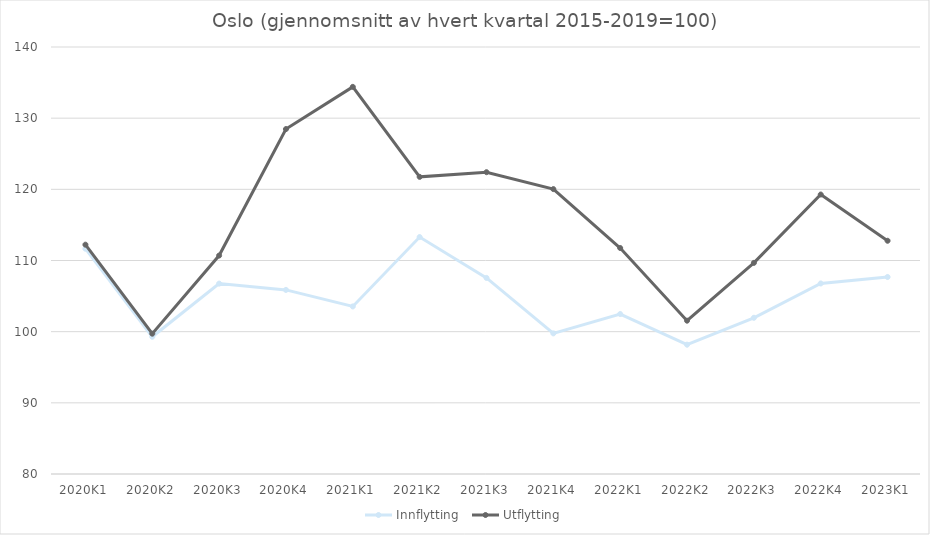
| Category | Innflytting  | Utflytting |
|---|---|---|
| 2020K1 | 111.66 | 112.224 |
| 2020K2 | 99.281 | 99.716 |
| 2020K3 | 106.751 | 110.694 |
| 2020K4 | 105.868 | 128.469 |
| 2021K1 | 103.546 | 134.399 |
| 2021K2 | 113.293 | 121.753 |
| 2021K3 | 107.549 | 122.407 |
| 2021K4 | 99.759 | 120.032 |
| 2022K1 | 102.478 | 111.753 |
| 2022K2 | 98.169 | 101.544 |
| 2022K3 | 101.949 | 109.666 |
| 2022K4 | 106.772 | 119.271 |
| 2023K1 | 107.68 | 112.774 |